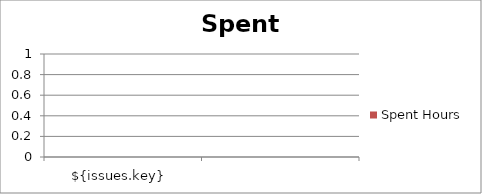
| Category | Spent Hours |
|---|---|
| ${issues.key}  | 0 |